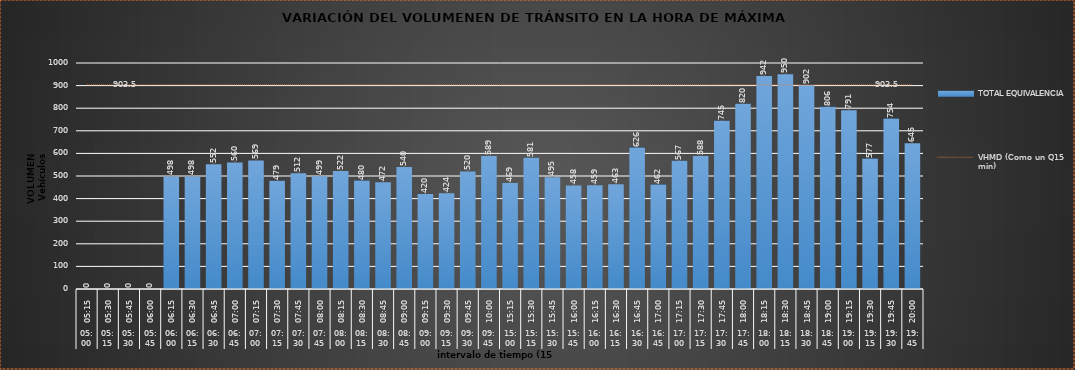
| Category | TOTAL EQUIVALENCIA   |
|---|---|
| 0 | 0 |
| 1 | 0 |
| 2 | 0 |
| 3 | 0 |
| 4 | 498 |
| 5 | 498 |
| 6 | 552 |
| 7 | 560 |
| 8 | 569 |
| 9 | 479 |
| 10 | 512 |
| 11 | 499 |
| 12 | 522 |
| 13 | 480 |
| 14 | 472 |
| 15 | 540 |
| 16 | 420 |
| 17 | 424 |
| 18 | 520 |
| 19 | 589 |
| 20 | 469 |
| 21 | 581 |
| 22 | 495 |
| 23 | 458 |
| 24 | 459 |
| 25 | 463 |
| 26 | 626 |
| 27 | 462 |
| 28 | 567 |
| 29 | 588 |
| 30 | 745 |
| 31 | 820 |
| 32 | 942 |
| 33 | 950 |
| 34 | 902 |
| 35 | 806 |
| 36 | 791 |
| 37 | 577 |
| 38 | 754 |
| 39 | 645 |